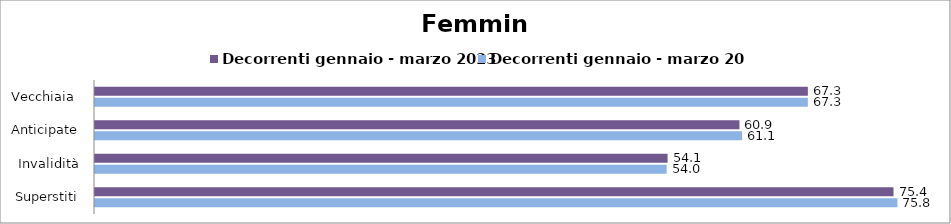
| Category | Decorrenti gennaio - marzo 2023 | Decorrenti gennaio - marzo 2024 |
|---|---|---|
| Vecchiaia  | 67.33 | 67.33 |
| Anticipate | 60.87 | 61.12 |
| Invalidità | 54.08 | 53.99 |
| Superstiti | 75.42 | 75.79 |